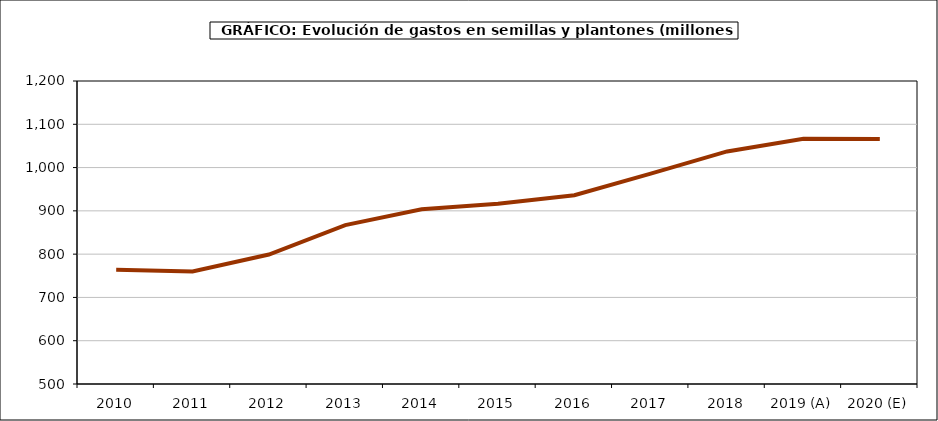
| Category | Semillas |
|---|---|
| 2010 | 763.963 |
| 2011 | 759.736 |
| 2012 | 799.053 |
| 2013 | 867.097 |
| 2014 | 903.589 |
| 2015 | 916.393 |
| 2016 | 936.239 |
| 2017 | 986.016 |
| 2018 | 1037.335 |
| 2019 (A) | 1066.777 |
| 2020 (E) | 1065.742 |